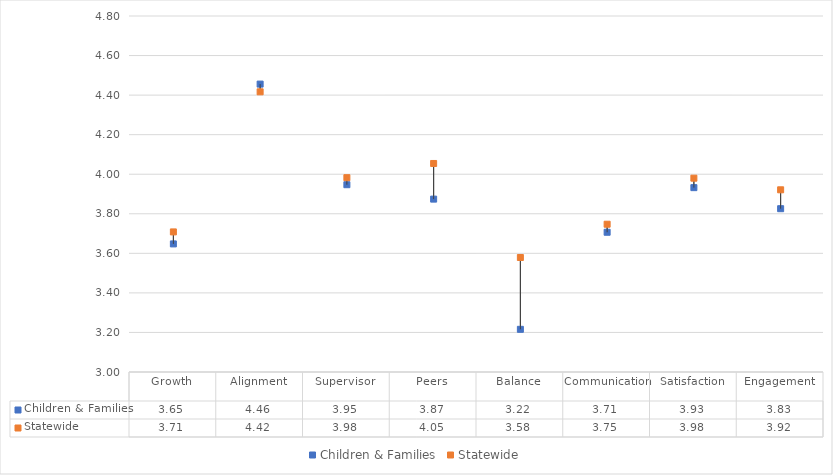
| Category | Children & Families | Statewide |
|---|---|---|
| Growth | 3.648 | 3.708 |
| Alignment | 4.456 | 4.417 |
| Supervisor | 3.947 | 3.983 |
| Peers | 3.874 | 4.054 |
| Balance | 3.216 | 3.579 |
| Communication | 3.707 | 3.747 |
| Satisfaction | 3.932 | 3.98 |
| Engagement | 3.826 | 3.921 |